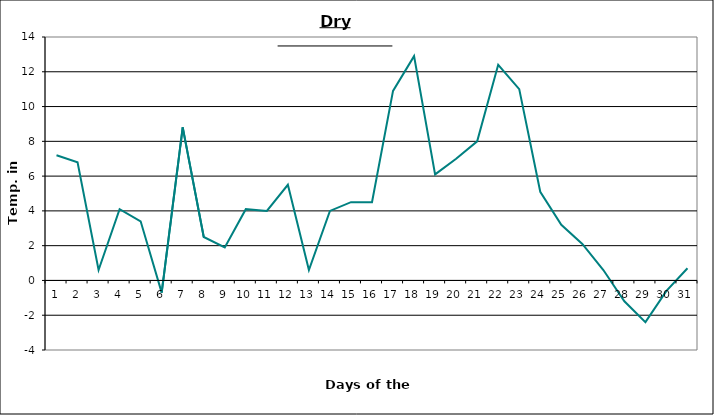
| Category | Series 0 |
|---|---|
| 0 | 7.2 |
| 1 | 6.8 |
| 2 | 0.6 |
| 3 | 4.1 |
| 4 | 3.4 |
| 5 | -0.7 |
| 6 | 8.8 |
| 7 | 2.5 |
| 8 | 1.9 |
| 9 | 4.1 |
| 10 | 4 |
| 11 | 5.5 |
| 12 | 0.6 |
| 13 | 4 |
| 14 | 4.5 |
| 15 | 4.5 |
| 16 | 10.9 |
| 17 | 12.9 |
| 18 | 6.1 |
| 19 | 7 |
| 20 | 8 |
| 21 | 12.4 |
| 22 | 11 |
| 23 | 5.1 |
| 24 | 3.2 |
| 25 | 2.1 |
| 26 | 0.6 |
| 27 | -1.2 |
| 28 | -2.4 |
| 29 | -0.6 |
| 30 | 0.7 |